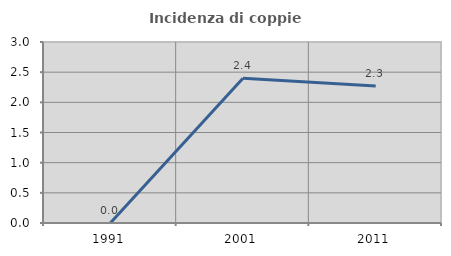
| Category | Incidenza di coppie miste |
|---|---|
| 1991.0 | 0 |
| 2001.0 | 2.4 |
| 2011.0 | 2.273 |